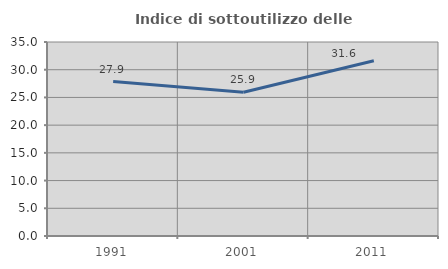
| Category | Indice di sottoutilizzo delle abitazioni  |
|---|---|
| 1991.0 | 27.869 |
| 2001.0 | 25.941 |
| 2011.0 | 31.628 |